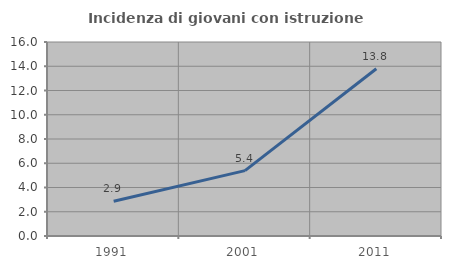
| Category | Incidenza di giovani con istruzione universitaria |
|---|---|
| 1991.0 | 2.87 |
| 2001.0 | 5.393 |
| 2011.0 | 13.793 |